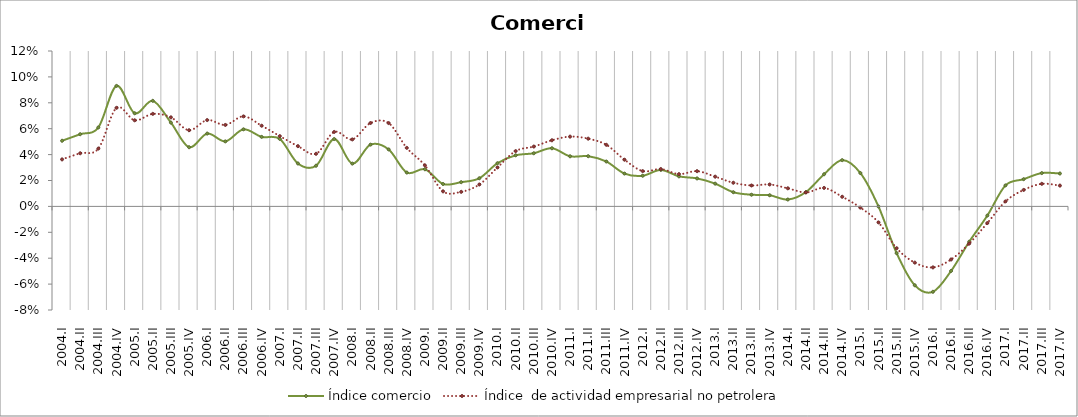
| Category | Índice comercio | Índice  de actividad empresarial no petrolera |
|---|---|---|
| 2004.I | 0.051 | 0.036 |
| 2004.II | 0.056 | 0.041 |
| 2004.III | 0.061 | 0.045 |
| 2004.IV | 0.093 | 0.076 |
| 2005.I | 0.072 | 0.066 |
| 2005.II | 0.082 | 0.071 |
| 2005.III | 0.065 | 0.069 |
| 2005.IV | 0.046 | 0.059 |
| 2006.I | 0.056 | 0.067 |
| 2006.II | 0.05 | 0.063 |
| 2006.III | 0.06 | 0.07 |
| 2006.IV | 0.054 | 0.062 |
| 2007.I | 0.052 | 0.054 |
| 2007.II | 0.033 | 0.047 |
| 2007.III | 0.031 | 0.041 |
| 2007.IV | 0.052 | 0.057 |
| 2008.I | 0.033 | 0.052 |
| 2008.II | 0.048 | 0.064 |
| 2008.III | 0.044 | 0.064 |
| 2008.IV | 0.026 | 0.045 |
| 2009.I | 0.029 | 0.032 |
| 2009.II | 0.017 | 0.012 |
| 2009.III | 0.019 | 0.011 |
| 2009.IV | 0.022 | 0.017 |
| 2010.I | 0.033 | 0.03 |
| 2010.II | 0.039 | 0.043 |
| 2010.III | 0.041 | 0.046 |
| 2010.IV | 0.045 | 0.051 |
| 2011.I | 0.039 | 0.054 |
| 2011.II | 0.039 | 0.052 |
| 2011.III | 0.035 | 0.048 |
| 2011.IV | 0.025 | 0.036 |
| 2012.I | 0.024 | 0.027 |
| 2012.II | 0.028 | 0.029 |
| 2012.III | 0.023 | 0.025 |
| 2012.IV | 0.022 | 0.027 |
| 2013.I | 0.018 | 0.023 |
| 2013.II | 0.011 | 0.018 |
| 2013.III | 0.009 | 0.016 |
| 2013.IV | 0.009 | 0.017 |
| 2014.I | 0.005 | 0.014 |
| 2014.II | 0.011 | 0.011 |
| 2014.III | 0.025 | 0.014 |
| 2014.IV | 0.036 | 0.007 |
| 2015.I | 0.026 | -0.001 |
| 2015.II | 0 | -0.012 |
| 2015.III | -0.036 | -0.032 |
| 2015.IV | -0.061 | -0.043 |
| 2016.I | -0.066 | -0.047 |
| 2016.II | -0.05 | -0.041 |
| 2016.III | -0.027 | -0.029 |
| 2016.IV | -0.007 | -0.013 |
| 2017.I | 0.016 | 0.004 |
| 2017.II | 0.021 | 0.013 |
| 2017.III | 0.026 | 0.017 |
| 2017.IV | 0.025 | 0.016 |